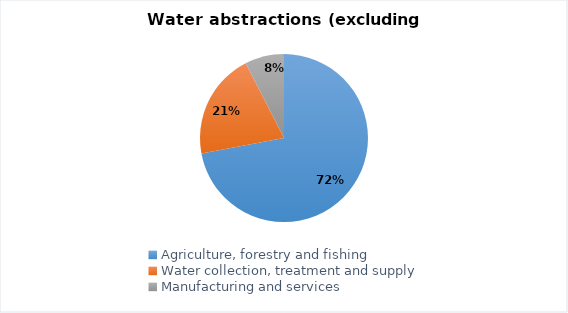
| Category | Series 1 |
|---|---|
| Agriculture, forestry and fishing | 2301.887 |
| Water collection, treatment and supply | 651.863 |
| Manufacturing and services | 240.269 |